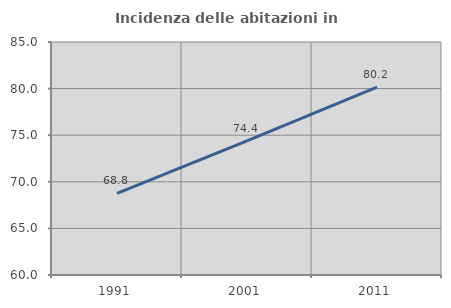
| Category | Incidenza delle abitazioni in proprietà  |
|---|---|
| 1991.0 | 68.75 |
| 2001.0 | 74.396 |
| 2011.0 | 80.165 |